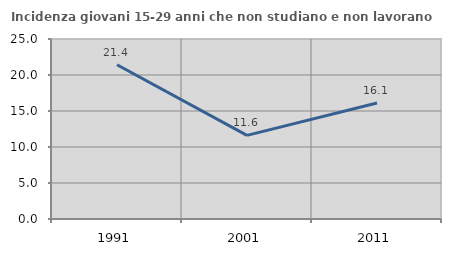
| Category | Incidenza giovani 15-29 anni che non studiano e non lavorano  |
|---|---|
| 1991.0 | 21.429 |
| 2001.0 | 11.613 |
| 2011.0 | 16.107 |